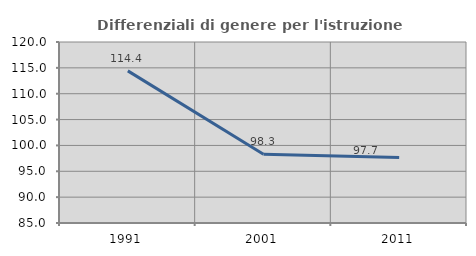
| Category | Differenziali di genere per l'istruzione superiore |
|---|---|
| 1991.0 | 114.421 |
| 2001.0 | 98.299 |
| 2011.0 | 97.675 |